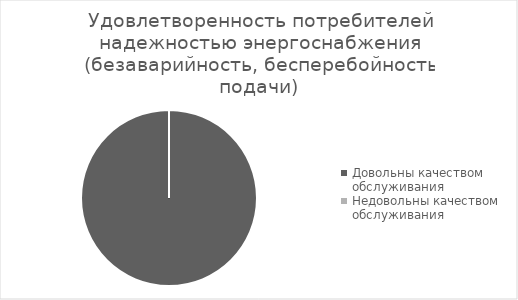
| Category | Удовлетворенность потребителей надежностью энергоснабжения |
|---|---|
| Довольны качеством обслуживания | 100 |
| Недовольны качеством обслуживания | 0 |